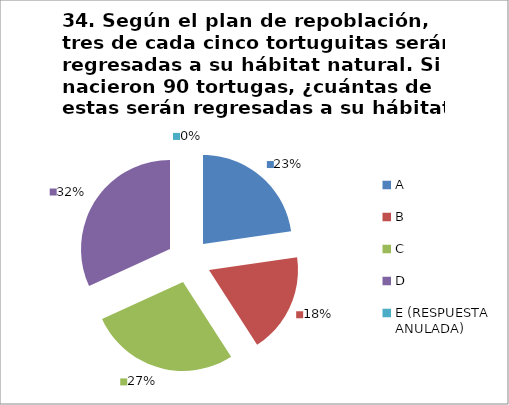
| Category | CANTIDAD DE RESPUESTAS PREGUNTA (34) | PORCENTAJE |
|---|---|---|
| A | 5 | 0.227 |
| B | 4 | 0.182 |
| C | 6 | 0.273 |
| D | 7 | 0.318 |
| E (RESPUESTA ANULADA) | 0 | 0 |